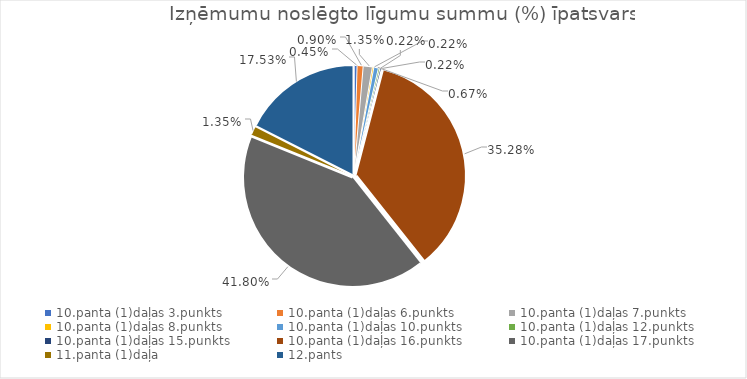
| Category | Īpatsvars (%) |
|---|---|
| 10.panta (1)daļas 3.punkts | 0.004 |
| 10.panta (1)daļas 6.punkts | 0.009 |
| 10.panta (1)daļas 7.punkts | 0.013 |
| 10.panta (1)daļas 8.punkts | 0.002 |
| 10.panta (1)daļas 10.punkts | 0.007 |
| 10.panta (1)daļas 12.punkts | 0.002 |
| 10.panta (1)daļas 15.punkts | 0.002 |
| 10.panta (1)daļas 16.punkts | 0.353 |
| 10.panta (1)daļas 17.punkts | 0.418 |
| 11.panta (1)daļa | 0.013 |
| 12.pants | 0.175 |